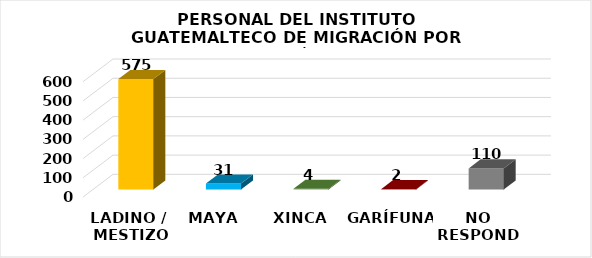
| Category | Series 0 |
|---|---|
| LADINO /
 MESTIZO | 575 |
| MAYA | 31 |
| XINCA | 4 |
| GARÍFUNA | 2 |
| NO RESPONDE | 110 |